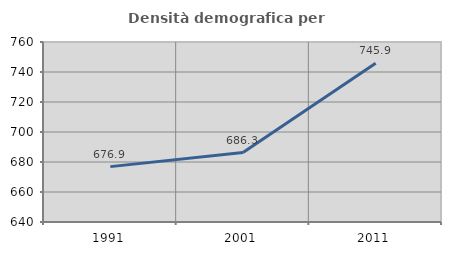
| Category | Densità demografica |
|---|---|
| 1991.0 | 676.919 |
| 2001.0 | 686.278 |
| 2011.0 | 745.859 |